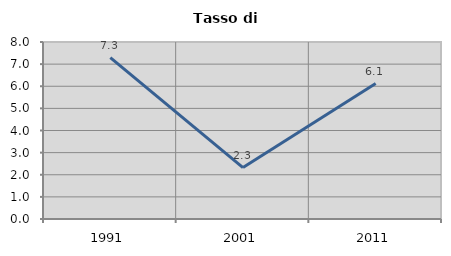
| Category | Tasso di disoccupazione   |
|---|---|
| 1991.0 | 7.292 |
| 2001.0 | 2.326 |
| 2011.0 | 6.122 |